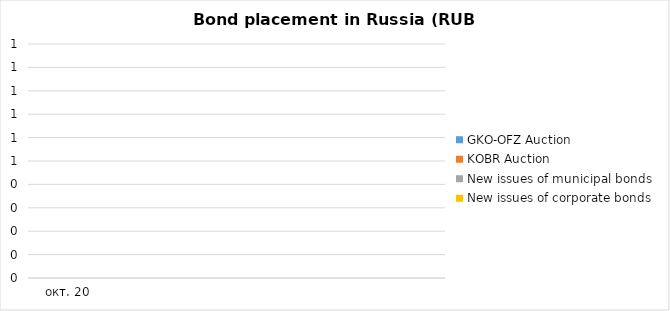
| Category | GKO-OFZ Auction | KOBR Auction | New issues of municipal bonds | New issues of corporate bonds |
|---|---|---|---|---|
| 2020-10-31 | 0 | 0 | 0 | 0 |
| 2020-11-30 | 0 | 0 | 0 | 0 |
| 2020-11-30 | 0 | 0 | 0 | 0 |
| 2020-12-31 | 0 | 0 | 0 | 0 |
| 2021-01-31 | 0 | 0 | 0 | 0 |
| 2021-02-28 | 0 | 0 | 0 | 0 |